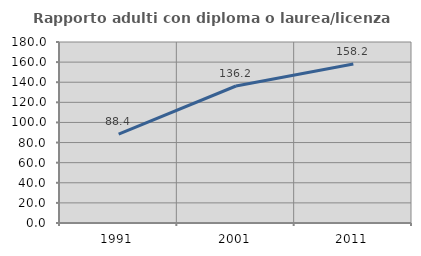
| Category | Rapporto adulti con diploma o laurea/licenza media  |
|---|---|
| 1991.0 | 88.422 |
| 2001.0 | 136.239 |
| 2011.0 | 158.219 |